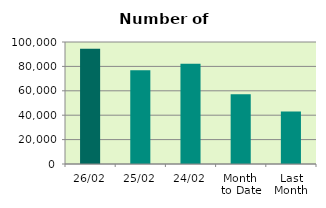
| Category | Series 0 |
|---|---|
| 26/02 | 94536 |
| 25/02 | 76772 |
| 24/02 | 82086 |
| Month 
to Date | 57256.556 |
| Last
Month | 43047.455 |